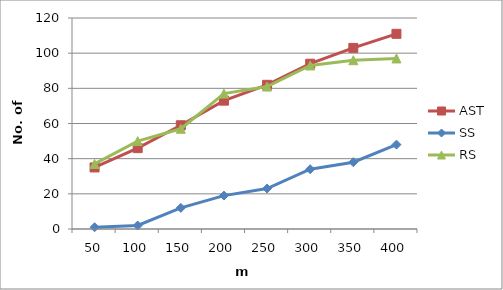
| Category | AST | SS | RS |
|---|---|---|---|
| 50.0 | 35 | 1 | 37 |
| 100.0 | 46 | 2 | 50 |
| 150.0 | 59 | 12 | 57 |
| 200.0 | 73 | 19 | 77 |
| 250.0 | 82 | 23 | 81 |
| 300.0 | 94 | 34 | 93 |
| 350.0 | 103 | 38 | 96 |
| 400.0 | 111 | 48 | 97 |